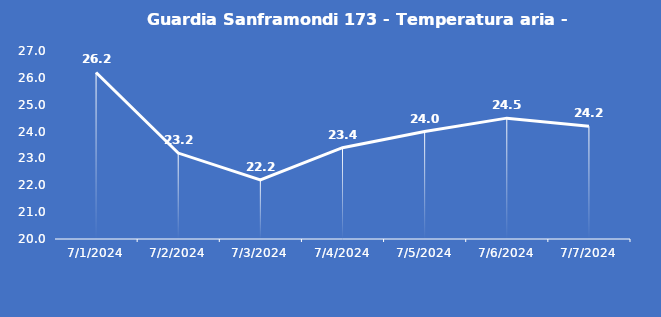
| Category | Guardia Sanframondi 173 - Temperatura aria - Grezzo (°C) |
|---|---|
| 7/1/24 | 26.2 |
| 7/2/24 | 23.2 |
| 7/3/24 | 22.2 |
| 7/4/24 | 23.4 |
| 7/5/24 | 24 |
| 7/6/24 | 24.5 |
| 7/7/24 | 24.2 |